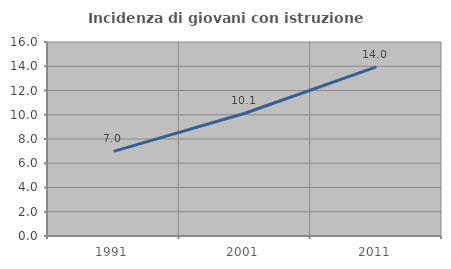
| Category | Incidenza di giovani con istruzione universitaria |
|---|---|
| 1991.0 | 6.977 |
| 2001.0 | 10.127 |
| 2011.0 | 13.953 |